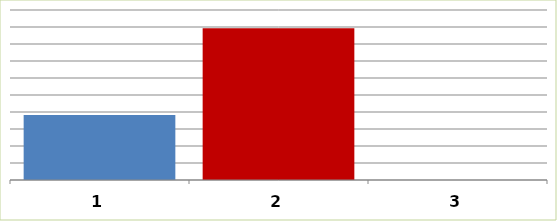
| Category | Series 0 |
|---|---|
| 0 | 19141960.64 |
| 1 | 44641357.82 |
| 2 | 0 |